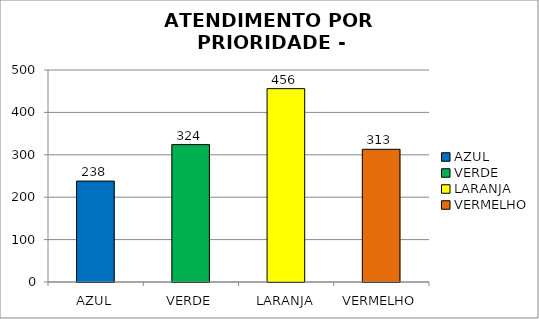
| Category | Total Regional: |
|---|---|
| AZUL | 238 |
| VERDE | 324 |
| LARANJA | 456 |
| VERMELHO | 313 |